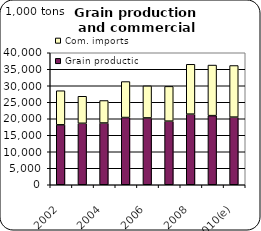
| Category | Grain production | Com. imports |
|---|---|---|
| 2002 | 18161.212 | 10337.485 |
| 2003 | 18625.231 | 8192 |
| 2004 | 18707.822 | 6820.933 |
| 2005 | 20371.745 | 10899.188 |
| 2006 | 20254.015 | 9709.215 |
| 2007 | 19275.25 | 10536.394 |
| 2008 | 21398.846 | 15107.19 |
| 2009 | 20944.145 | 15325.318 |
| 2010(e) | 20495 | 15640.403 |